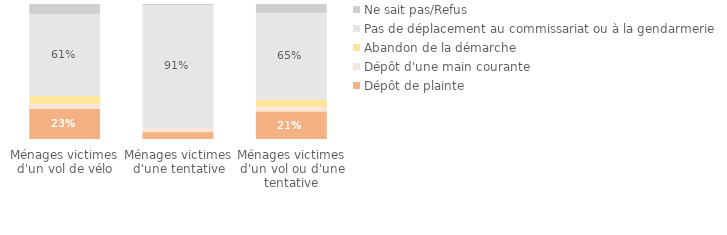
| Category | Dépôt de plainte | Dépôt d'une main courante | Abandon de la démarche | Pas de déplacement au commissariat ou à la gendarmerie | Ne sait pas/Refus |
|---|---|---|---|---|---|
| Ménages victimes d'un vol ou d'une tentative | 0.208 | 0.038 | 0.05 | 0.646 | 0.057 |
| Ménages victimes d'une tentative | 0.057 | 0.035 | 0 | 0.908 | 0 |
| Ménages victimes d'un vol de vélo | 0.23 | 0.039 | 0.057 | 0.608 | 0.065 |